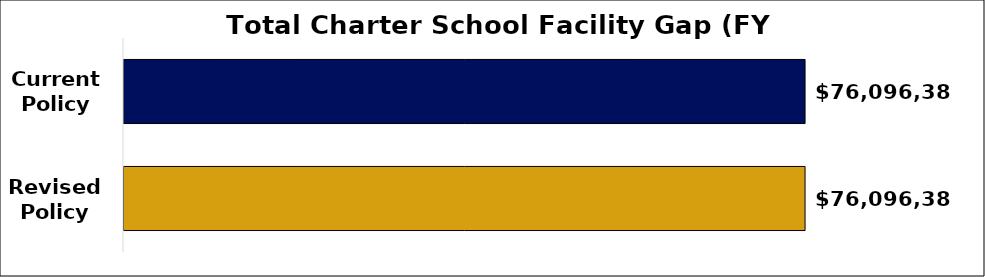
| Category | Facility Gap Funding Amount |
|---|---|
| Current
Policy | 76096386.602 |
| Revised
Policy | 76096386.602 |